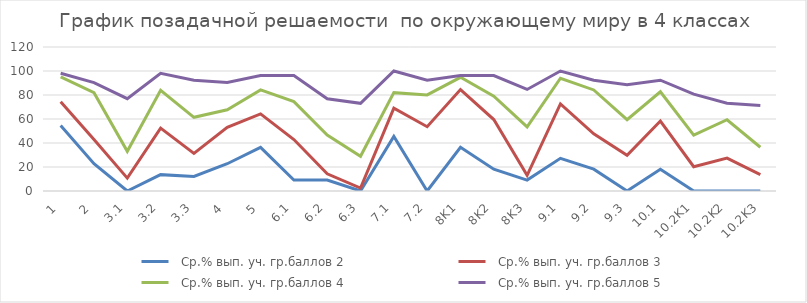
| Category |   Ср.% вып. уч. гр.баллов 2 |   Ср.% вып. уч. гр.баллов 3 |   Ср.% вып. уч. гр.баллов 4 |   Ср.% вып. уч. гр.баллов 5 |
|---|---|---|---|---|
| 1 | 54.55 | 74.4 | 95.11 | 98.08 |
| 2 | 22.73 | 42.86 | 81.95 | 90.38 |
| 3,1 | 0 | 10.71 | 33.08 | 76.92 |
| 3,2 | 13.64 | 52.38 | 83.83 | 98.08 |
| 3,3 | 12.12 | 31.35 | 61.4 | 92.31 |
| 4 | 22.73 | 52.98 | 67.67 | 90.38 |
| 5 | 36.36 | 64.29 | 84.21 | 96.15 |
| 6,1 | 9.09 | 42.86 | 74.44 | 96.15 |
| 6,2 | 9.09 | 14.29 | 46.62 | 76.92 |
| 6,3 | 0 | 2.38 | 28.95 | 73.08 |
| 7,1 | 45.45 | 69.05 | 81.95 | 100 |
| 7,2 | 0 | 53.57 | 80.08 | 92.31 |
| 8K1 | 36.36 | 84.52 | 94.74 | 96.15 |
| 8K2 | 18.18 | 59.52 | 78.95 | 96.15 |
| 8K3 | 9.09 | 13.1 | 53.38 | 84.62 |
| 9,1 | 27.27 | 72.62 | 93.98 | 100 |
| 9,2 | 18.18 | 47.62 | 84.21 | 92.31 |
| 9,3 | 0 | 29.76 | 59.4 | 88.46 |
| 10,1 | 18.18 | 58.33 | 82.71 | 92.31 |
| 10.2K1 | 0 | 20.24 | 46.62 | 80.77 |
| 10.2K2 | 0 | 27.38 | 59.4 | 73.08 |
| 10.2K3 | 0 | 13.69 | 36.47 | 71.15 |